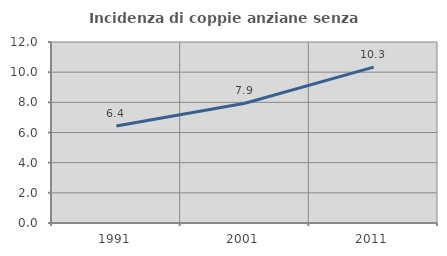
| Category | Incidenza di coppie anziane senza figli  |
|---|---|
| 1991.0 | 6.431 |
| 2001.0 | 7.937 |
| 2011.0 | 10.336 |